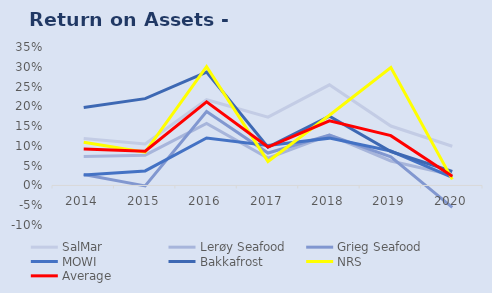
| Category | SalMar | Lerøy Seafood | Grieg Seafood | MOWI | Bakkafrost | NRS | Average |
|---|---|---|---|---|---|---|---|
| 2014.0 | 0.119 | 0.073 | 0.028 | 0.026 | 0.197 | 0.109 | 0.092 |
| 2015.0 | 0.105 | 0.076 | -0.001 | 0.037 | 0.22 | 0.084 | 0.087 |
| 2016.0 | 0.217 | 0.157 | 0.187 | 0.12 | 0.287 | 0.3 | 0.211 |
| 2017.0 | 0.173 | 0.069 | 0.082 | 0.101 | 0.097 | 0.06 | 0.097 |
| 2018.0 | 0.254 | 0.127 | 0.127 | 0.12 | 0.175 | 0.178 | 0.164 |
| 2019.0 | 0.15 | 0.062 | 0.073 | 0.087 | 0.086 | 0.298 | 0.126 |
| 2020.0 | 0.099 | 0.026 | -0.055 | 0.02 | 0.035 | 0.015 | 0.023 |